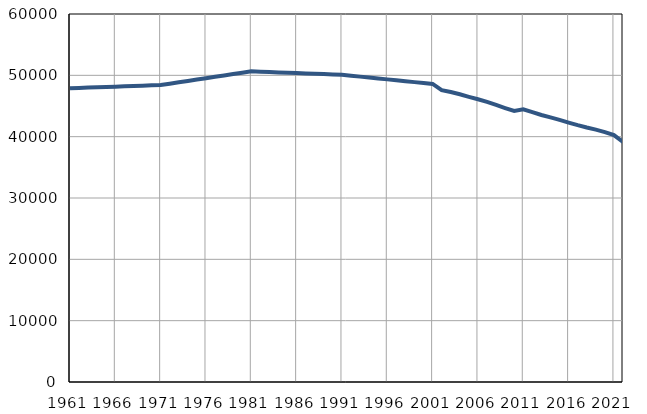
| Category | Број
становника |
|---|---|
| 1961.0 | 47894 |
| 1962.0 | 47947 |
| 1963.0 | 47999 |
| 1964.0 | 48052 |
| 1965.0 | 48104 |
| 1966.0 | 48157 |
| 1967.0 | 48210 |
| 1968.0 | 48262 |
| 1969.0 | 48315 |
| 1970.0 | 48367 |
| 1971.0 | 48420 |
| 1972.0 | 48643 |
| 1973.0 | 48866 |
| 1974.0 | 49089 |
| 1975.0 | 49312 |
| 1976.0 | 49536 |
| 1977.0 | 49759 |
| 1978.0 | 49982 |
| 1979.0 | 50205 |
| 1980.0 | 50428 |
| 1981.0 | 50651 |
| 1982.0 | 50595 |
| 1983.0 | 50538 |
| 1984.0 | 50482 |
| 1985.0 | 50425 |
| 1986.0 | 50369 |
| 1987.0 | 50313 |
| 1988.0 | 50256 |
| 1989.0 | 50200 |
| 1990.0 | 50143 |
| 1991.0 | 50087 |
| 1992.0 | 49938 |
| 1993.0 | 49789 |
| 1994.0 | 49639 |
| 1995.0 | 49490 |
| 1996.0 | 49341 |
| 1997.0 | 49192 |
| 1998.0 | 49043 |
| 1999.0 | 48894 |
| 2000.0 | 48744 |
| 2001.0 | 48595 |
| 2002.0 | 47589 |
| 2003.0 | 47272 |
| 2004.0 | 46917 |
| 2005.0 | 46492 |
| 2006.0 | 46092 |
| 2007.0 | 45670 |
| 2008.0 | 45167 |
| 2009.0 | 44663 |
| 2010.0 | 44194 |
| 2011.0 | 44473 |
| 2012.0 | 43990 |
| 2013.0 | 43533 |
| 2014.0 | 43140 |
| 2015.0 | 42730 |
| 2016.0 | 42298 |
| 2017.0 | 41872 |
| 2018.0 | 41492 |
| 2019.0 | 41154 |
| 2020.0 | 40749 |
| 2021.0 | 40260 |
| 2022.0 | 39125 |